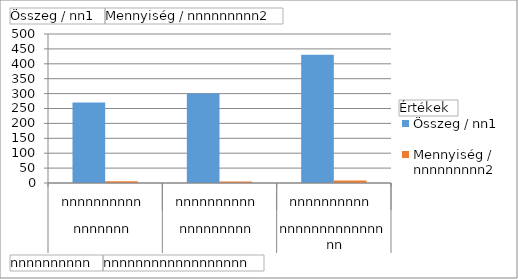
| Category | Összeg / nn1 | Mennyiség / nnnnnnnnn2 |
|---|---|---|
| 0 | 270 | 6 |
| 1 | 300 | 5 |
| 2 | 430 | 8 |